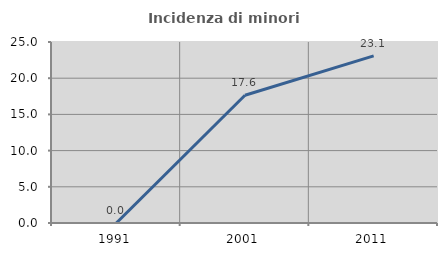
| Category | Incidenza di minori stranieri |
|---|---|
| 1991.0 | 0 |
| 2001.0 | 17.647 |
| 2011.0 | 23.077 |